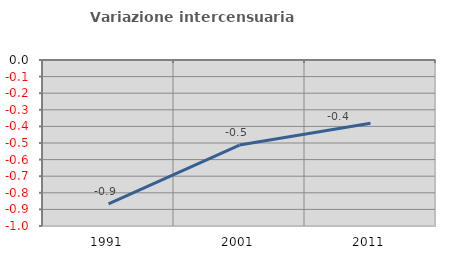
| Category | Variazione intercensuaria annua |
|---|---|
| 1991.0 | -0.867 |
| 2001.0 | -0.512 |
| 2011.0 | -0.381 |